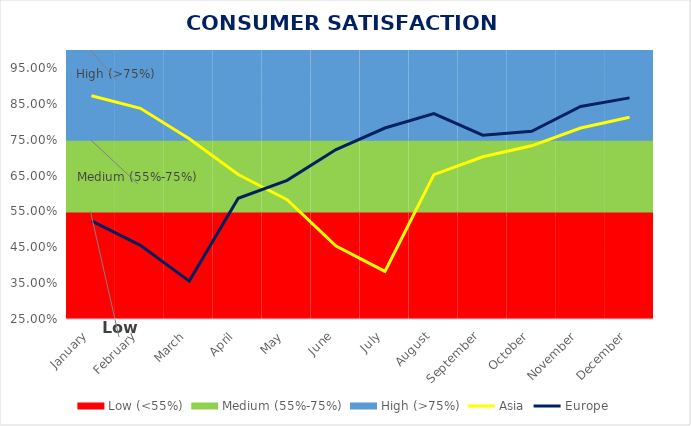
| Category | Low (<55%) | Medium (55%-75%) | High (>75%) |
|---|---|---|---|
| January | 0.55 | 0.2 | 0.25 |
| February | 0.55 | 0.2 | 0.25 |
| March | 0.55 | 0.2 | 0.25 |
| April | 0.55 | 0.2 | 0.25 |
| May | 0.55 | 0.2 | 0.25 |
| June | 0.55 | 0.2 | 0.25 |
| July | 0.55 | 0.2 | 0.25 |
| August | 0.55 | 0.2 | 0.25 |
| September | 0.55 | 0.2 | 0.25 |
| October | 0.55 | 0.2 | 0.25 |
| November | 0.55 | 0.2 | 0.25 |
| December | 0.55 | 0.2 | 0.25 |